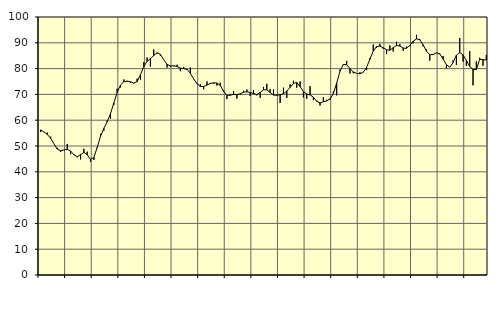
| Category | Piggar | Series 1 |
|---|---|---|
| nan | 55.4 | 56.25 |
| 87.0 | 55.5 | 55.45 |
| 87.0 | 55.2 | 54.48 |
| 87.0 | 53.6 | 53 |
| nan | 50.8 | 50.82 |
| 88.0 | 49.3 | 48.79 |
| 88.0 | 47.7 | 48.13 |
| 88.0 | 48.4 | 48.47 |
| nan | 50.8 | 48.72 |
| 89.0 | 46.8 | 48.03 |
| 89.0 | 46.9 | 46.59 |
| 89.0 | 45.6 | 45.87 |
| nan | 44.8 | 46.64 |
| 90.0 | 48.9 | 47.52 |
| 90.0 | 47.8 | 46.57 |
| 90.0 | 43.8 | 44.8 |
| nan | 44.6 | 45.58 |
| 91.0 | 49.2 | 49.44 |
| 91.0 | 54.7 | 53.76 |
| 91.0 | 55.9 | 56.87 |
| nan | 59.8 | 59.3 |
| 92.0 | 60.5 | 62.55 |
| 92.0 | 65.9 | 66.69 |
| 92.0 | 72.2 | 70.76 |
| nan | 72.7 | 73.61 |
| 93.0 | 75.8 | 74.86 |
| 93.0 | 75 | 75.17 |
| 93.0 | 74.6 | 74.88 |
| nan | 74.2 | 74.39 |
| 94.0 | 76.1 | 74.98 |
| 94.0 | 75.7 | 77.6 |
| 94.0 | 82.5 | 80.82 |
| nan | 84.3 | 82.81 |
| 95.0 | 80.8 | 83.87 |
| 95.0 | 87.4 | 85.09 |
| 95.0 | 85.9 | 86.15 |
| nan | 85 | 85.51 |
| 96.0 | 83.4 | 83.43 |
| 96.0 | 80.4 | 81.68 |
| 96.0 | 80.6 | 81.03 |
| nan | 80.9 | 81.08 |
| 97.0 | 81.5 | 80.82 |
| 97.0 | 79 | 80.17 |
| 97.0 | 80.6 | 80.03 |
| nan | 79.5 | 79.73 |
| 98.0 | 80.4 | 78.2 |
| 98.0 | 75.9 | 76.02 |
| 98.0 | 74.4 | 74.2 |
| nan | 73.9 | 73.1 |
| 99.0 | 72 | 73.06 |
| 99.0 | 75 | 73.61 |
| 99.0 | 74.4 | 74.27 |
| nan | 74.2 | 74.49 |
| 0.0 | 73.4 | 74.42 |
| 0.0 | 74.5 | 73.49 |
| 0.0 | 71.6 | 71.17 |
| nan | 68.2 | 69.64 |
| 1.0 | 70.1 | 69.68 |
| 1.0 | 71.3 | 70.01 |
| 1.0 | 68.4 | 69.91 |
| nan | 69.9 | 70.2 |
| 2.0 | 71.4 | 70.86 |
| 2.0 | 71.9 | 71 |
| 2.0 | 69.4 | 70.78 |
| nan | 71.7 | 70.28 |
| 3.0 | 69.6 | 69.96 |
| 3.0 | 68.7 | 70.72 |
| 3.0 | 72.9 | 71.78 |
| nan | 74.1 | 71.79 |
| 4.0 | 72.1 | 70.73 |
| 4.0 | 71.9 | 69.72 |
| 4.0 | 70 | 69.68 |
| nan | 66.7 | 69.89 |
| 5.0 | 72.6 | 70.22 |
| 5.0 | 68.6 | 71.31 |
| 5.0 | 73.9 | 72.74 |
| nan | 75.3 | 74.24 |
| 6.0 | 72.6 | 74.65 |
| 6.0 | 75 | 73.01 |
| 6.0 | 68.8 | 71.06 |
| nan | 68.3 | 70.11 |
| 7.0 | 73.2 | 69.82 |
| 7.0 | 67.8 | 68.94 |
| 7.0 | 67.6 | 67.33 |
| nan | 65.7 | 66.72 |
| 8.0 | 69 | 67.14 |
| 8.0 | 67.9 | 67.48 |
| 8.0 | 67.9 | 68.23 |
| nan | 71.2 | 70.26 |
| 9.0 | 69.6 | 74.36 |
| 9.0 | 79.6 | 78.98 |
| 9.0 | 81.8 | 81.6 |
| nan | 83 | 81.55 |
| 10.0 | 78.1 | 80.02 |
| 10.0 | 78.2 | 78.7 |
| 10.0 | 78 | 78.12 |
| nan | 78.6 | 77.98 |
| 11.0 | 78.6 | 78.56 |
| 11.0 | 79.4 | 80.49 |
| 11.0 | 84.1 | 83.67 |
| nan | 89.3 | 86.79 |
| 12.0 | 88 | 88.56 |
| 12.0 | 89.6 | 88.72 |
| 12.0 | 87.7 | 88.06 |
| nan | 85.6 | 87.29 |
| 13.0 | 89 | 87.11 |
| 13.0 | 86.6 | 88.11 |
| 13.0 | 90.4 | 88.94 |
| nan | 89.5 | 88.73 |
| 14.0 | 86.9 | 87.97 |
| 14.0 | 88.6 | 87.85 |
| 14.0 | 88.7 | 89.03 |
| nan | 89.8 | 90.59 |
| 15.0 | 93.1 | 91.51 |
| 15.0 | 91.4 | 91.17 |
| 15.0 | 88.6 | 89.25 |
| nan | 87.4 | 86.73 |
| 16.0 | 83.1 | 85.42 |
| 16.0 | 85.6 | 85.44 |
| 16.0 | 86.3 | 86.13 |
| nan | 85.9 | 85.67 |
| 17.0 | 84.9 | 83.7 |
| 17.0 | 80.1 | 81.51 |
| 17.0 | 80.5 | 80.51 |
| nan | 83.2 | 82.29 |
| 18.0 | 81.4 | 85.22 |
| 18.0 | 91.9 | 86.25 |
| 18.0 | 82.7 | 85.33 |
| nan | 81 | 83.14 |
| 19.0 | 86.8 | 80.82 |
| 19.0 | 73.5 | 79.67 |
| 19.0 | 82.8 | 79.65 |
| nan | 84.2 | 83.61 |
| 20.0 | 81.1 | 83.43 |
| 20.0 | 85.3 | 83.33 |